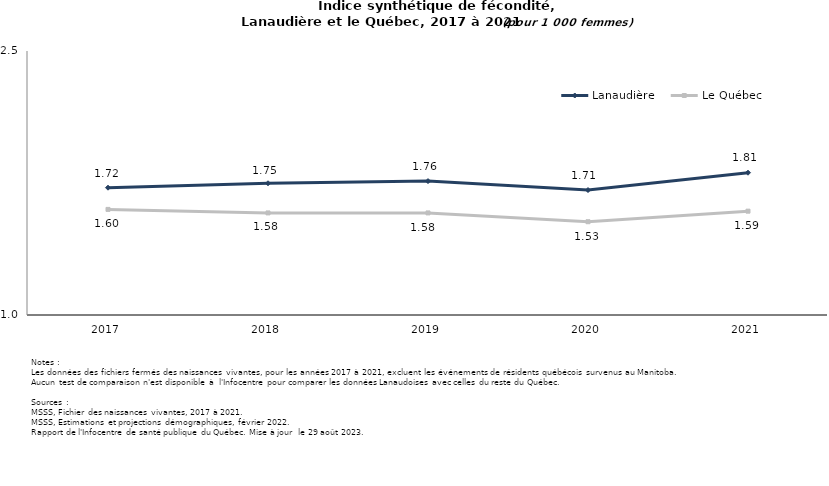
| Category | Lanaudière | Le Québec |
|---|---|---|
| 2017.0 | 1.723 | 1.6 |
| 2018.0 | 1.749 | 1.58 |
| 2019.0 | 1.761 | 1.58 |
| 2020.0 | 1.71 | 1.53 |
| 2021.0 | 1.808 | 1.59 |